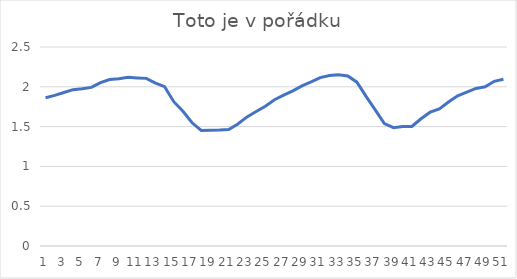
| Category | Series 0 |
|---|---|
| 0 | 1.862 |
| 1 | 1.892 |
| 2 | 1.928 |
| 3 | 1.964 |
| 4 | 1.975 |
| 5 | 1.993 |
| 6 | 2.053 |
| 7 | 2.092 |
| 8 | 2.102 |
| 9 | 2.119 |
| 10 | 2.112 |
| 11 | 2.106 |
| 12 | 2.046 |
| 13 | 2.001 |
| 14 | 1.813 |
| 15 | 1.692 |
| 16 | 1.548 |
| 17 | 1.451 |
| 18 | 1.454 |
| 19 | 1.456 |
| 20 | 1.463 |
| 21 | 1.532 |
| 22 | 1.622 |
| 23 | 1.689 |
| 24 | 1.756 |
| 25 | 1.838 |
| 26 | 1.895 |
| 27 | 1.949 |
| 28 | 2.011 |
| 29 | 2.061 |
| 30 | 2.116 |
| 31 | 2.143 |
| 32 | 2.151 |
| 33 | 2.137 |
| 34 | 2.058 |
| 35 | 1.879 |
| 36 | 1.709 |
| 37 | 1.537 |
| 38 | 1.487 |
| 39 | 1.502 |
| 40 | 1.501 |
| 41 | 1.598 |
| 42 | 1.681 |
| 43 | 1.723 |
| 44 | 1.809 |
| 45 | 1.887 |
| 46 | 1.933 |
| 47 | 1.979 |
| 48 | 2.001 |
| 49 | 2.069 |
| 50 | 2.094 |